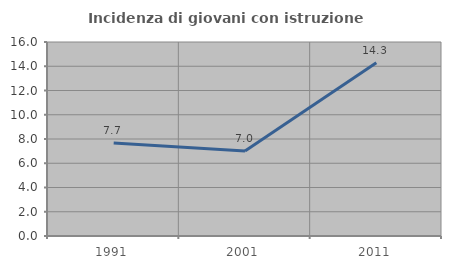
| Category | Incidenza di giovani con istruzione universitaria |
|---|---|
| 1991.0 | 7.675 |
| 2001.0 | 7.005 |
| 2011.0 | 14.286 |